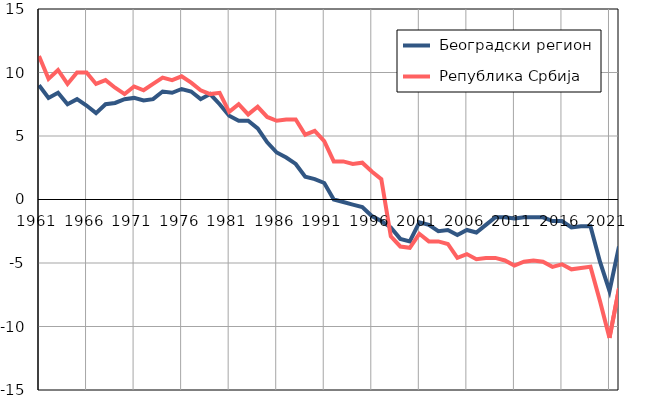
| Category |  Београдски регион |  Република Србија |
|---|---|---|
| 1961.0 | 9 | 11.3 |
| 1962.0 | 8 | 9.5 |
| 1963.0 | 8.4 | 10.2 |
| 1964.0 | 7.5 | 9.1 |
| 1965.0 | 7.9 | 10 |
| 1966.0 | 7.4 | 10 |
| 1967.0 | 6.8 | 9.1 |
| 1968.0 | 7.5 | 9.4 |
| 1969.0 | 7.6 | 8.8 |
| 1970.0 | 7.9 | 8.3 |
| 1971.0 | 8 | 8.9 |
| 1972.0 | 7.8 | 8.6 |
| 1973.0 | 7.9 | 9.1 |
| 1974.0 | 8.5 | 9.6 |
| 1975.0 | 8.4 | 9.4 |
| 1976.0 | 8.7 | 9.7 |
| 1977.0 | 8.5 | 9.2 |
| 1978.0 | 7.9 | 8.6 |
| 1979.0 | 8.3 | 8.3 |
| 1980.0 | 7.5 | 8.4 |
| 1981.0 | 6.6 | 6.9 |
| 1982.0 | 6.2 | 7.5 |
| 1983.0 | 6.2 | 6.7 |
| 1984.0 | 5.6 | 7.3 |
| 1985.0 | 4.5 | 6.5 |
| 1986.0 | 3.7 | 6.2 |
| 1987.0 | 3.3 | 6.3 |
| 1988.0 | 2.8 | 6.3 |
| 1989.0 | 1.8 | 5.1 |
| 1990.0 | 1.6 | 5.4 |
| 1991.0 | 1.3 | 4.6 |
| 1992.0 | 0 | 3 |
| 1993.0 | -0.2 | 3 |
| 1994.0 | -0.4 | 2.8 |
| 1995.0 | -0.6 | 2.9 |
| 1996.0 | -1.3 | 2.2 |
| 1997.0 | -1.7 | 1.6 |
| 1998.0 | -2.2 | -2.9 |
| 1999.0 | -3.1 | -3.7 |
| 2000.0 | -3.3 | -3.8 |
| 2001.0 | -1.8 | -2.7 |
| 2002.0 | -2 | -3.3 |
| 2003.0 | -2.5 | -3.3 |
| 2004.0 | -2.4 | -3.5 |
| 2005.0 | -2.8 | -4.6 |
| 2006.0 | -2.4 | -4.3 |
| 2007.0 | -2.6 | -4.7 |
| 2008.0 | -2 | -4.6 |
| 2009.0 | -1.4 | -4.6 |
| 2010.0 | -1.4 | -4.8 |
| 2011.0 | -1.5 | -5.2 |
| 2012.0 | -1.4 | -4.9 |
| 2013.0 | -1.4 | -4.8 |
| 2014.0 | -1.4 | -4.9 |
| 2015.0 | -1.7 | -5.3 |
| 2016.0 | -1.7 | -5.1 |
| 2017.0 | -2.2 | -5.5 |
| 2018.0 | -2.1 | -5.4 |
| 2019.0 | -2.1 | -5.3 |
| 2020.0 | -4.9 | -8 |
| 2021.0 | -7.2 | -10.9 |
| 2022.0 | -3.7 | -7 |